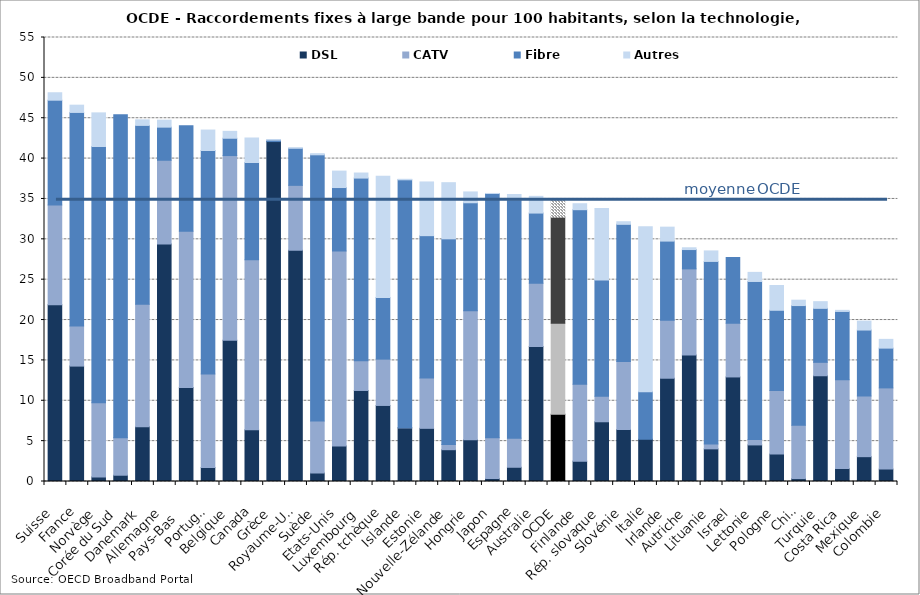
| Category | DSL | CATV | Fibre | Autres |
|---|---|---|---|---|
| Suisse | 21.908 | 12.335 | 12.991 | 0.923 |
| France | 14.296 | 4.974 | 26.448 | 0.899 |
| Norvège | 0.57 | 9.189 | 31.735 | 4.169 |
| Corée du Sud | 0.777 | 4.657 | 39.997 | 0 |
| Danemark | 6.785 | 15.169 | 22.158 | 0.688 |
| Allemagne | 29.423 | 10.37 | 4.103 | 0.86 |
| Pays-Bas    | 11.636 | 19.375 | 13.049 | 0 |
| Portugal | 1.733 | 11.573 | 27.693 | 2.536 |
| Belgique | 17.488 | 22.888 | 2.146 | 0.852 |
| Canada | 6.407 | 21.07 | 12.042 | 3.031 |
| Grèce | 42.109 | 0 | 0.185 | 0.047 |
| Royaume-Uni | 28.66 | 8.024 | 4.594 | 0.033 |
| Suède | 1.052 | 6.43 | 32.985 | 0.144 |
| Etats-Unis | 4.404 | 24.149 | 7.861 | 2.035 |
| Luxembourg | 11.277 | 3.693 | 22.616 | 0.626 |
| Rép. tchèque | 9.421 | 5.737 | 7.643 | 15.015 |
| Islande | 6.642 | 0.029 | 30.701 | 0.064 |
| Estonie | 6.586 | 6.232 | 17.635 | 6.653 |
| Nouvelle-Zélande | 3.939 | 0.644 | 25.478 | 6.954 |
| Hongrie | 5.166 | 15.986 | 13.376 | 1.342 |
| Japon | 0.37 | 5.063 | 30.246 | 0.001 |
| Espagne | 1.763 | 3.597 | 29.541 | 0.652 |
| Australie | 16.711 | 7.849 | 8.692 | 2.07 |
| OCDE | 8.324 | 11.267 | 13.163 | 2.161 |
| Finlande | 2.519 | 9.538 | 21.613 | 0.738 |
| Rép. slovaque | 7.399 | 3.162 | 14.397 | 8.871 |
| Slovénie | 6.437 | 8.442 | 16.977 | 0.324 |
| Italie | 5.233 | 0 | 5.889 | 20.428 |
| Irlande | 12.793 | 7.196 | 9.791 | 1.727 |
| Autriche | 15.655 | 10.685 | 2.392 | 0.221 |
| Lituanie | 4.044 | 0.614 | 22.604 | 1.301 |
| Israel | 12.952 | 6.653 | 8.146 | 0 |
| Lettonie | 4.531 | 0.667 | 19.581 | 1.125 |
| Pologne | 3.398 | 7.871 | 9.941 | 3.067 |
| Chili | 0.36 | 6.598 | 14.836 | 0.666 |
| Turquie | 13.099 | 1.664 | 6.687 | 0.827 |
| Costa Rica | 1.597 | 10.997 | 8.47 | 0.137 |
| Mexique | 3.076 | 7.515 | 8.171 | 1.106 |
| Colombie | 1.535 | 10.059 | 4.928 | 1.084 |